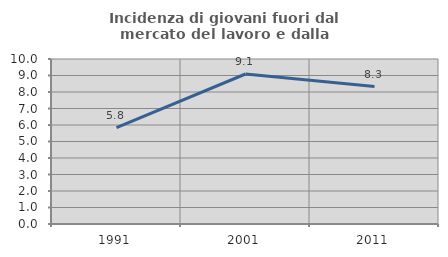
| Category | Incidenza di giovani fuori dal mercato del lavoro e dalla formazione  |
|---|---|
| 1991.0 | 5.844 |
| 2001.0 | 9.091 |
| 2011.0 | 8.333 |